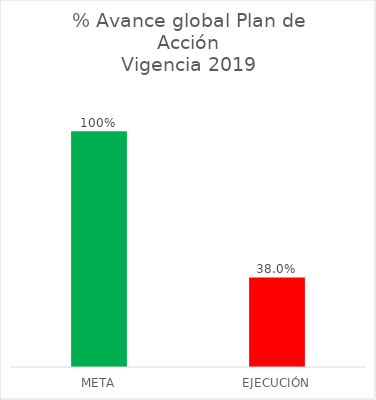
| Category | % Avance global Plan de Acción
Vigencia 2019 |
|---|---|
| META | 1 |
| EJECUCIÓN | 0.38 |